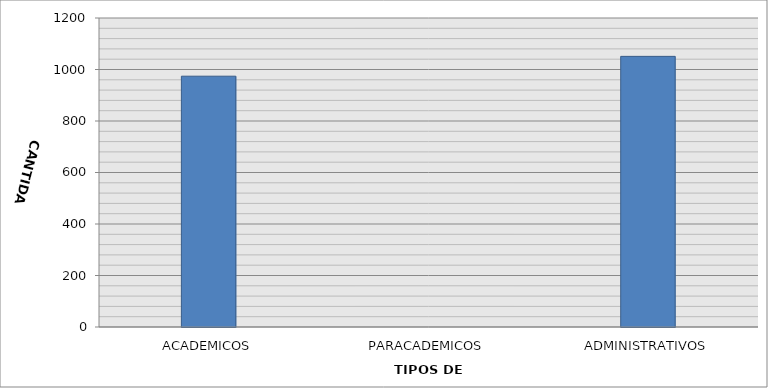
| Category | CANTIDAD |
|---|---|
| ACADEMICOS | 974 |
| PARACADEMICOS | 0 |
| ADMINISTRATIVOS | 1051 |